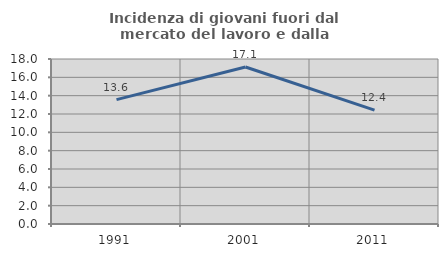
| Category | Incidenza di giovani fuori dal mercato del lavoro e dalla formazione  |
|---|---|
| 1991.0 | 13.568 |
| 2001.0 | 17.127 |
| 2011.0 | 12.426 |